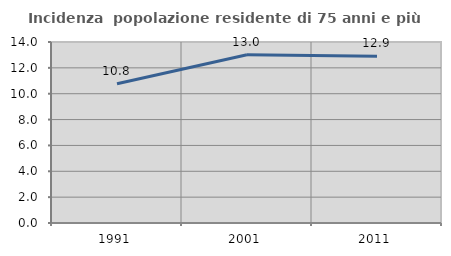
| Category | Incidenza  popolazione residente di 75 anni e più |
|---|---|
| 1991.0 | 10.765 |
| 2001.0 | 13.007 |
| 2011.0 | 12.888 |